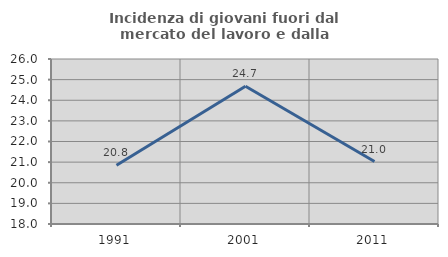
| Category | Incidenza di giovani fuori dal mercato del lavoro e dalla formazione  |
|---|---|
| 1991.0 | 20.844 |
| 2001.0 | 24.678 |
| 2011.0 | 21.027 |